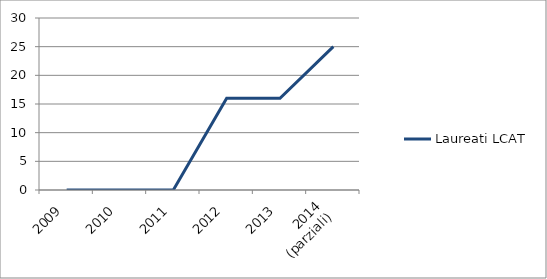
| Category | Laureati LCAT |
|---|---|
| 2009 | 0 |
| 2010 | 0 |
| 2011 | 0 |
| 2012 | 16 |
| 2013 | 16 |
| 2014
(parziali) | 25 |